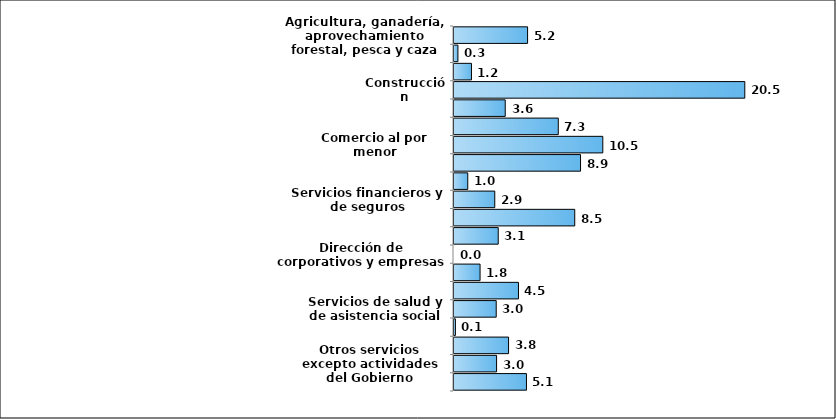
| Category | Campeche |
|---|---|
| Agricultura, ganadería, aprovechamiento forestal, pesca y caza | 5.182 |
| Minería | 0.276 |
| Electricidad, agua y suministro de gas por ductos al consumidor final | 1.229 |
| Construcción | 20.479 |
| Industrias manufactureras | 3.609 |
| Comercio al por mayor | 7.344 |
| Comercio al por menor | 10.479 |
| Transportes, correos y almacenamiento | 8.911 |
| Información en medios masivos | 0.97 |
| Servicios financieros y de seguros | 2.871 |
| Servicios inmobiliarios y de alquiler de bienes muebles e intangibles | 8.503 |
| Servicios profesionales, científicos y técnicos | 3.115 |
| Dirección de corporativos y empresas | 0 |
| Servicios de apoyo a los negocios y manejo de desechos y servicios de remediación | 1.836 |
| Servicios educativos | 4.541 |
| Servicios de salud y de asistencia social | 2.974 |
| Servicios de esparcimiento culturales y deportivos, y otros servicios recreativos | 0.1 |
| Servicios de alojamiento temporal y de preparación de alimentos y bebidas | 3.843 |
| Otros servicios excepto actividades del Gobierno | 2.999 |
| Actividades del Gobierno | 5.103 |